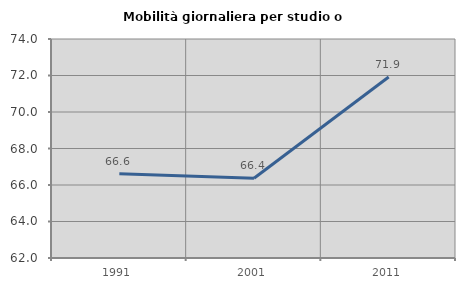
| Category | Mobilità giornaliera per studio o lavoro |
|---|---|
| 1991.0 | 66.617 |
| 2001.0 | 66.372 |
| 2011.0 | 71.917 |